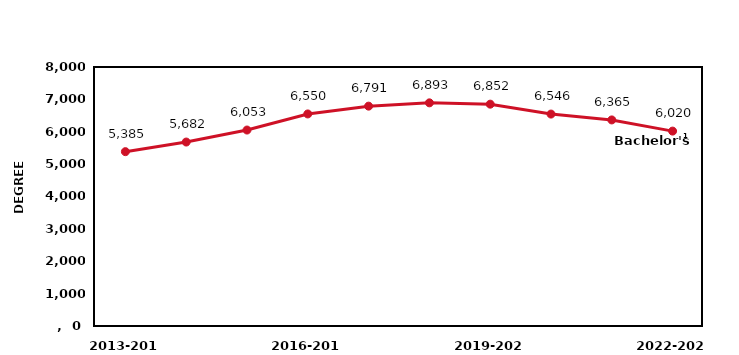
| Category | Series 0 |
|---|---|
| 2013-2014 | 5385 |
| 2014-2015 | 5682 |
| 2015-2016 | 6053 |
| 2016-2017 | 6550 |
| 2017-2018 | 6791 |
| 2018-2019 | 6893 |
| 2019-2020 | 6852 |
| 2020-2021 | 6546 |
| 2021-2022 | 6365 |
| 2022-2023 | 6020 |